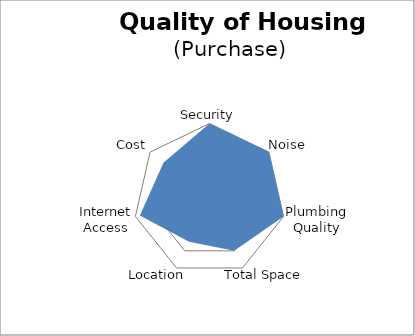
| Category | Series 0 |
|---|---|
| Security | 100 |
| Noise | 100 |
| Plumbing Quality | 100 |
| Total Space | 74.842 |
| Location | 61.878 |
| Internet Access | 93.962 |
| Cost | 77.523 |